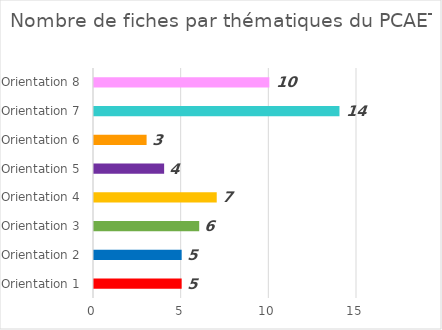
| Category | Series 0 |
|---|---|
| Orientation 1 | 5 |
| Orientation 2 | 5 |
| Orientation 3 | 6 |
| Orientation 4 | 7 |
| Orientation 5 | 4 |
| Orientation 6 | 3 |
| Orientation 7 | 14 |
| Orientation 8 | 10 |